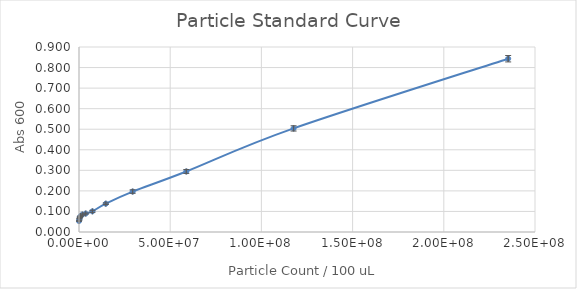
| Category | Series 0 |
|---|---|
| 235294117.64705887 | 0.843 |
| 117647058.82352944 | 0.504 |
| 58823529.41176472 | 0.294 |
| 29411764.70588236 | 0.197 |
| 14705882.35294118 | 0.138 |
| 7352941.17647059 | 0.1 |
| 3676470.588235295 | 0.09 |
| 1838235.2941176475 | 0.085 |
| 919117.6470588237 | 0.078 |
| 459558.82352941186 | 0.072 |
| 229779.41176470593 | 0.062 |
| 0.0 | 0.053 |